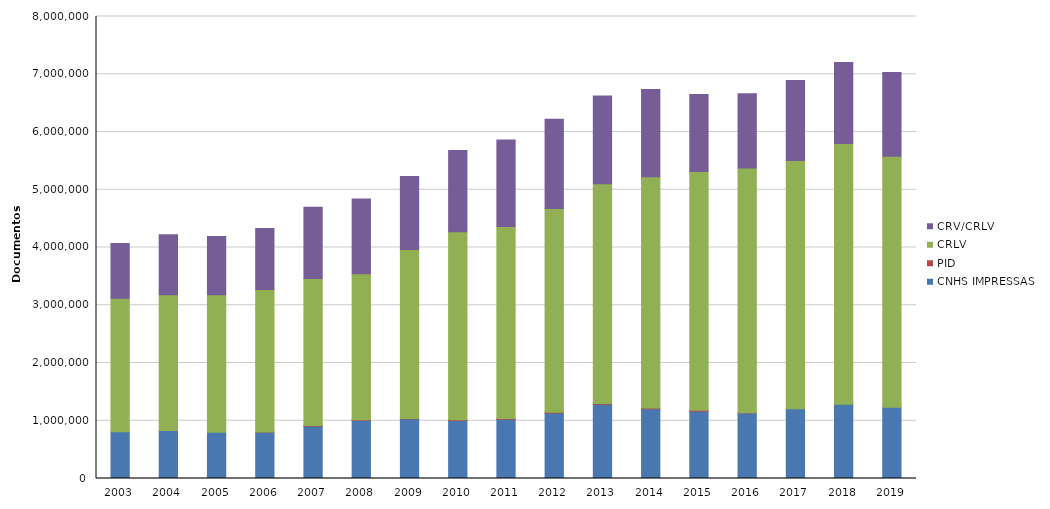
| Category | CNHS IMPRESSAS | PID | CRLV | CRV/CRLV |
|---|---|---|---|---|
| 2003 | 811583 | 0 | 2308761 | 950178 |
| 2004 | 830391 | 0 | 2351048 | 1040275 |
| 2005 | 800113 | 0 | 2380599 | 1009281 |
| 2006 | 804126 | 3168 | 2464383 | 1057320 |
| 2007 | 907857 | 8082 | 2545694 | 1237087 |
| 2008 | 1008511 | 9237 | 2526508 | 1296803 |
| 2009 | 1031261 | 9631 | 2925722 | 1260970 |
| 2010 | 1005236 | 12710 | 3253494 | 1409954 |
| 2011 | 1026155 | 12903 | 3325713 | 1495210 |
| 2012 | 1133301 | 12189 | 3529363 | 1547953 |
| 2013 | 1285536 | 14353 | 3803581 | 1521289 |
| 2014 | 1206722 | 15347 | 4001328 | 1510600 |
| 2015 | 1165465 | 14767 | 4136841 | 1334155 |
| 2016 | 1136265 | 4320 | 4235484 | 1286393 |
| 2017 | 1206143 | 0 | 4302144 | 1384931 |
| 2018 | 1285326 | 0 | 4515441 | 1401895 |
| 2019 | 1231823 | 0 | 4350329 | 1447774 |